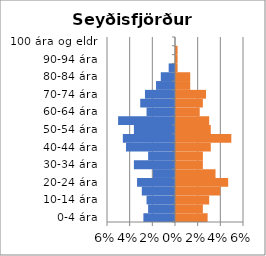
| Category | % karlar | %konur |
|---|---|---|
| 0-4 ára | -0.028 | 0.028 |
| 5-9 ára | -0.024 | 0.024 |
| 10-14 ára | -0.025 | 0.029 |
| 15-19 ára | -0.029 | 0.039 |
| 20-24 ára | -0.033 | 0.046 |
| 25-29 ára | -0.02 | 0.035 |
| 30-34 ára | -0.036 | 0.024 |
| 35-39 ára | -0.024 | 0.024 |
| 40-44 ára | -0.043 | 0.031 |
| 45-49 ára | -0.046 | 0.049 |
| 50-54 ára | -0.036 | 0.031 |
| 55-59 ára | -0.05 | 0.029 |
| 60-64 ára | -0.025 | 0.021 |
| 65-69 ára | -0.031 | 0.024 |
| 70-74 ára | -0.026 | 0.026 |
| 75-79 ára | -0.017 | 0.013 |
| 80-84 ára | -0.013 | 0.013 |
| 85-89 ára | -0.006 | 0.001 |
| 90-94 ára | 0 | 0.001 |
| 95-99 ára | 0 | 0.001 |
| 100 ára og eldri | 0 | 0 |